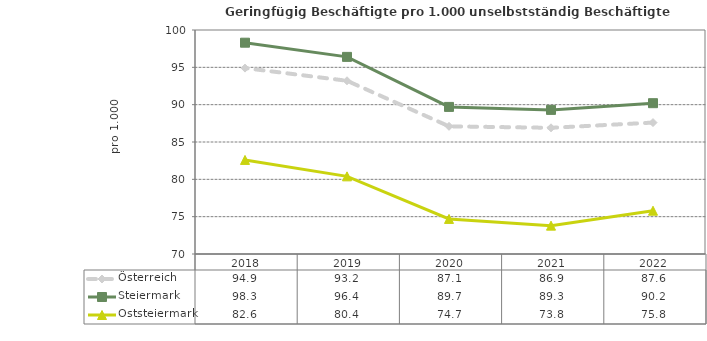
| Category | Österreich | Steiermark | Oststeiermark |
|---|---|---|---|
| 2022.0 | 87.6 | 90.2 | 75.8 |
| 2021.0 | 86.9 | 89.3 | 73.8 |
| 2020.0 | 87.1 | 89.7 | 74.7 |
| 2019.0 | 93.2 | 96.4 | 80.4 |
| 2018.0 | 94.9 | 98.3 | 82.6 |